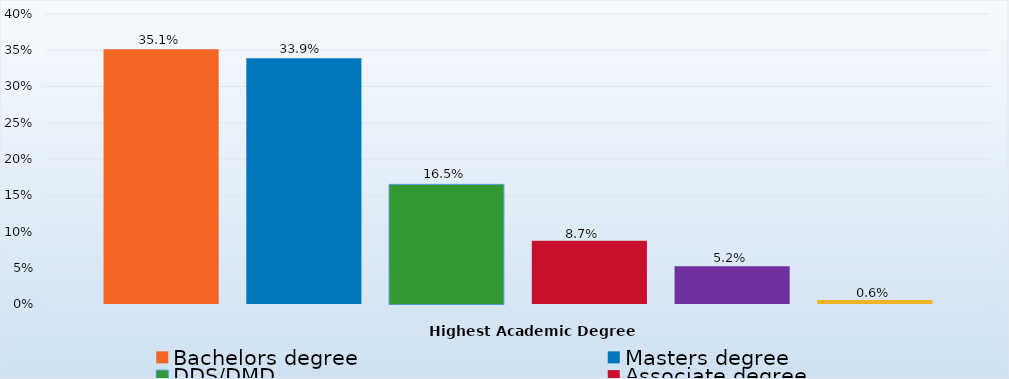
| Category | Bachelors degree | Masters degree | DDS/DMD | Associate degree | Doctorate degree | Certificate/Diploma/Other |
|---|---|---|---|---|---|---|
| Percent | 0.351 | 0.339 | 0.165 | 0.087 | 0.052 | 0.006 |